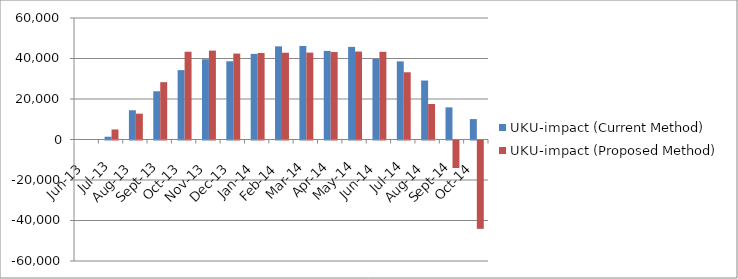
| Category | UKU-impact (Current Method) | UKU-impact (Proposed Method) |
|---|---|---|
| 2013-06-01 | 0 | 0 |
| 2013-07-01 | 1369.489 | 4953 |
| 2013-08-01 | 14446.563 | 12765 |
| 2013-09-01 | 23824.689 | 28311 |
| 2013-10-01 | 34270.01 | 43338 |
| 2013-11-01 | 39645.135 | 43895 |
| 2013-12-01 | 38649.31 | 42433.667 |
| 2014-01-01 | 42284.644 | 42718.667 |
| 2014-02-01 | 45999.107 | 42842.667 |
| 2014-03-01 | 46189.325 | 42907.667 |
| 2014-04-01 | 43753.938 | 43191.667 |
| 2014-05-01 | 45735.451 | 43431.667 |
| 2014-06-01 | 39777.01 | 43306.167 |
| 2014-07-01 | 38582.007 | 33202.667 |
| 2014-08-01 | 29120.87 | 17517.667 |
| 2014-09-01 | 15867.171 | -13574.333 |
| 2014-10-01 | 10081.873 | -43628.333 |